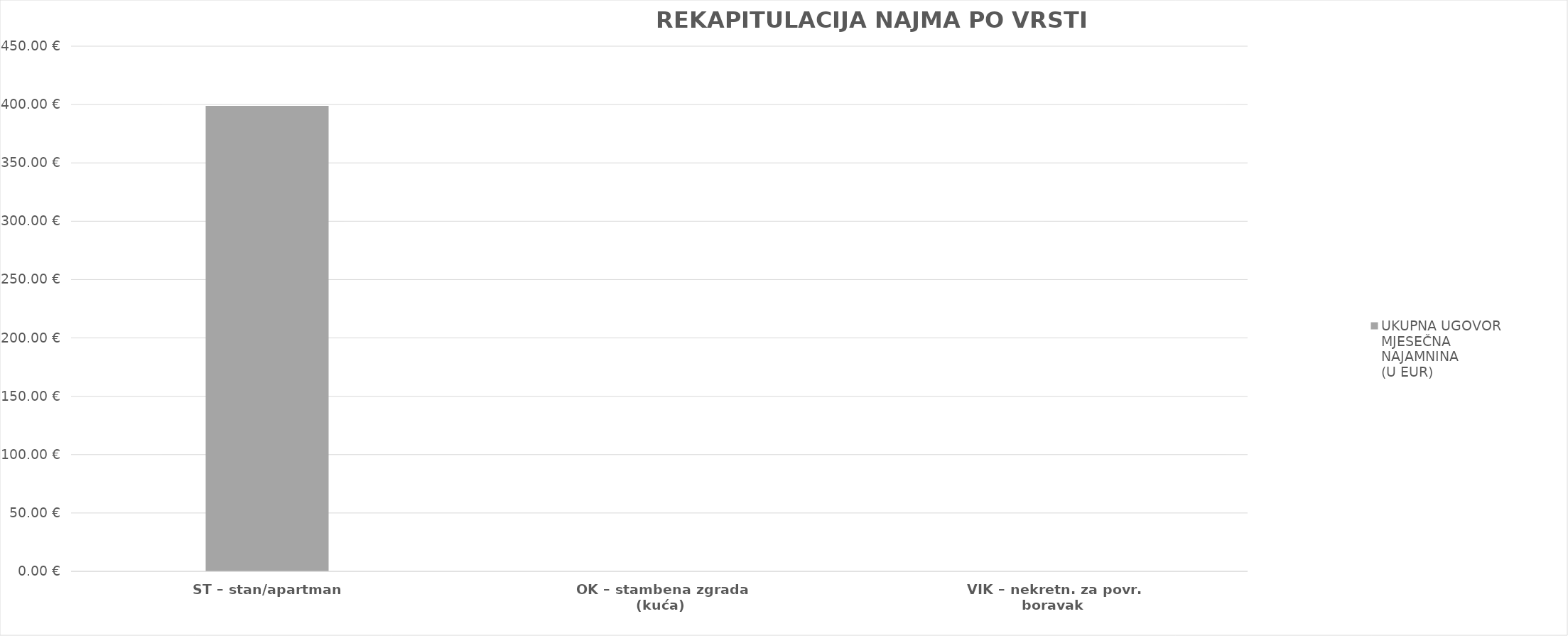
| Category | UKUPNA UGOVORENA MJESEČNA NAJAMNINA 
(U EUR) |
|---|---|
| ST – stan/apartman | 398.88 |
| OK – stambena zgrada (kuća) | 0 |
| VIK – nekretn. za povr. boravak | 0 |